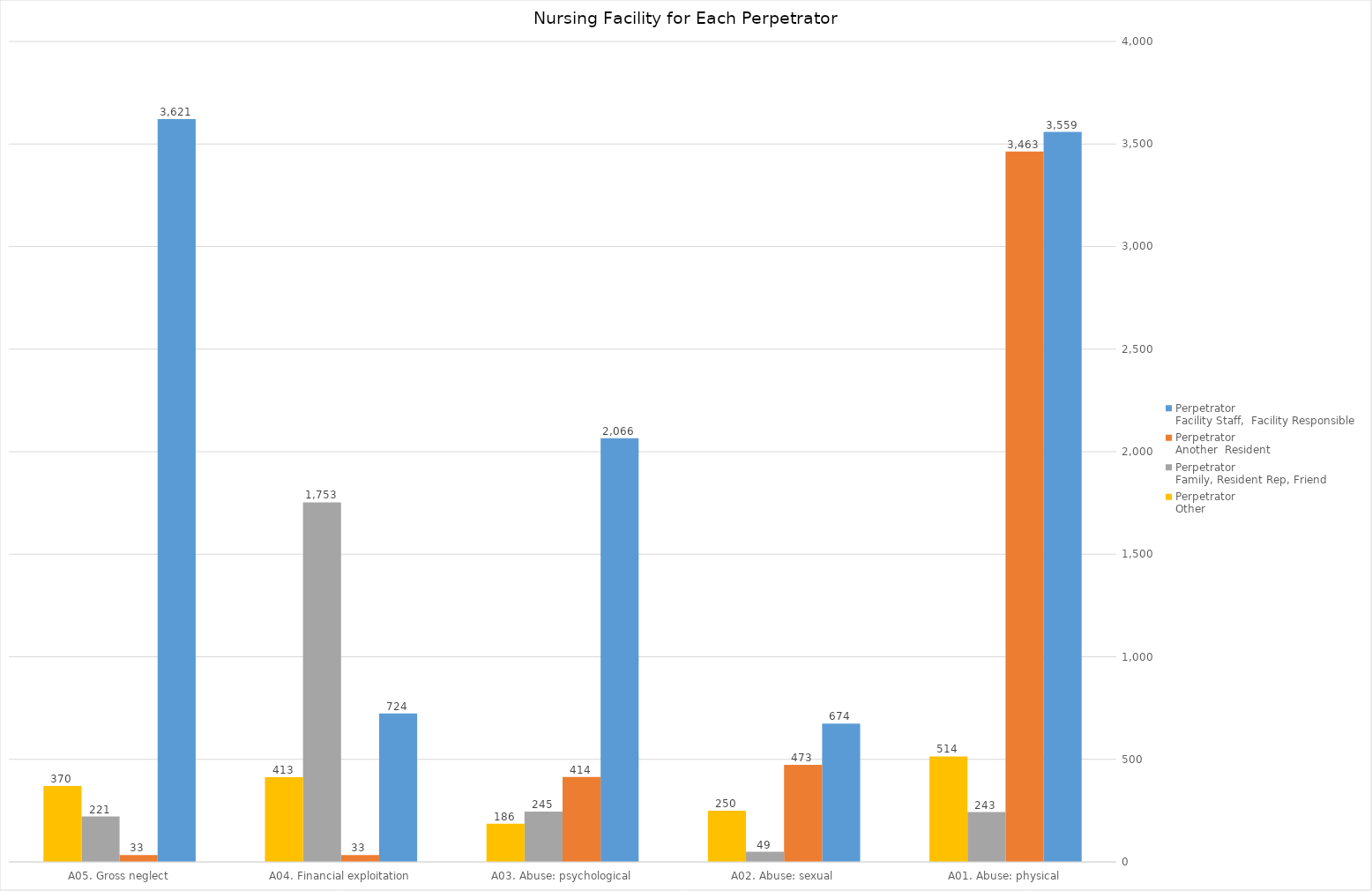
| Category | Perpetrator
Facility Staff,  Facility Responsible | Perpetrator
Another  Resident | Perpetrator
Family, Resident Rep, Friend | Perpetrator
Other |
|---|---|---|---|---|
| A01. Abuse: physical | 3559 | 3463 | 243 | 514 |
| A02. Abuse: sexual | 674 | 473 | 49 | 250 |
| A03. Abuse: psychological | 2066 | 414 | 245 | 186 |
| A04. Financial exploitation | 724 | 33 | 1753 | 413 |
| A05. Gross neglect | 3621 | 33 | 221 | 370 |